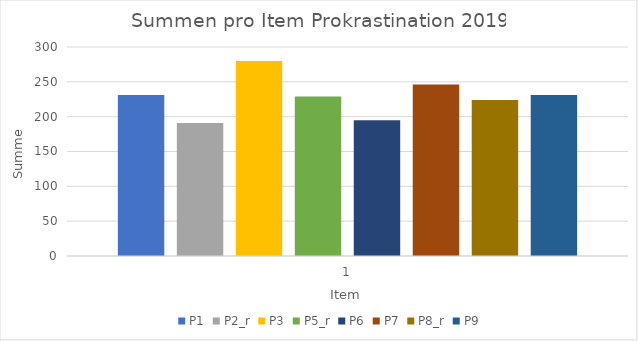
| Category | P1 | P2_r | P3 | P5_r | P6 | P7 | P8_r | P9 |
|---|---|---|---|---|---|---|---|---|
| 0 | 231 | 191 | 280 | 229 | 195 | 246 | 224 | 231 |